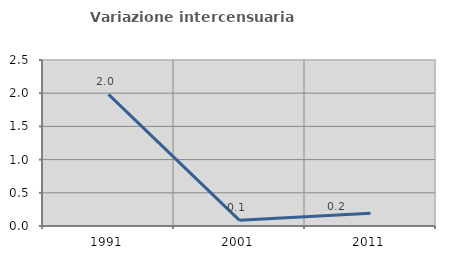
| Category | Variazione intercensuaria annua |
|---|---|
| 1991.0 | 1.983 |
| 2001.0 | 0.085 |
| 2011.0 | 0.194 |